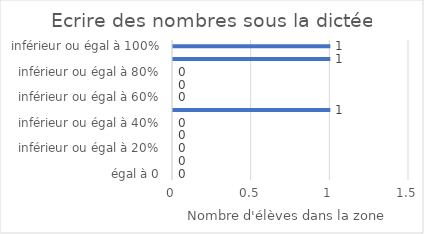
| Category | Ecrire des nombres sous la dictée |
|---|---|
| égal à 0 | 0 |
| inférieur ou égal à 10% | 0 |
| inférieur ou égal à 20% | 0 |
| inférieur ou égal à 30% | 0 |
| inférieur ou égal à 40% | 0 |
| inférieur ou égal à 50% | 1 |
| inférieur ou égal à 60% | 0 |
| inférieur ou égal à 70% | 0 |
| inférieur ou égal à 80% | 0 |
| inférieur ou égal à 90% | 1 |
| inférieur ou égal à 100% | 1 |